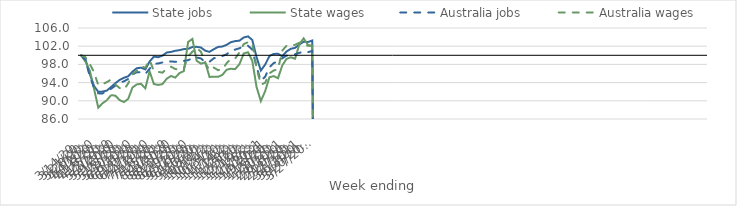
| Category | State jobs | State wages | Australia jobs | Australia wages |
|---|---|---|---|---|
| 14/03/2020 | 100 | 100 | 100 | 100 |
| 21/03/2020 | 99.174 | 98.598 | 98.97 | 99.607 |
| 28/03/2020 | 95.983 | 96.695 | 95.464 | 98.117 |
| 04/04/2020 | 93.268 | 92.691 | 92.906 | 96.324 |
| 11/04/2020 | 91.975 | 88.5 | 91.634 | 93.472 |
| 18/04/2020 | 92.022 | 89.452 | 91.618 | 93.672 |
| 25/04/2020 | 92.245 | 90.113 | 92.147 | 94.096 |
| 02/05/2020 | 93.033 | 91.255 | 92.646 | 94.684 |
| 09/05/2020 | 93.876 | 91.115 | 93.336 | 93.578 |
| 16/05/2020 | 94.582 | 90.156 | 93.928 | 92.809 |
| 23/05/2020 | 95.063 | 89.718 | 94.284 | 92.46 |
| 30/05/2020 | 95.39 | 90.434 | 94.792 | 93.812 |
| 06/06/2020 | 96.408 | 92.931 | 95.776 | 95.91 |
| 13/06/2020 | 97.159 | 93.596 | 96.277 | 96.583 |
| 20/06/2020 | 97.272 | 93.733 | 96.294 | 97.554 |
| 27/06/2020 | 96.895 | 92.734 | 95.892 | 97.289 |
| 04/07/2020 | 98.636 | 96.482 | 97.055 | 98.973 |
| 11/07/2020 | 99.711 | 93.685 | 98.106 | 96.533 |
| 18/07/2020 | 99.578 | 93.489 | 98.208 | 96.372 |
| 25/07/2020 | 99.916 | 93.666 | 98.434 | 96.181 |
| 01/08/2020 | 100.612 | 94.852 | 98.654 | 97.055 |
| 08/08/2020 | 100.748 | 95.455 | 98.656 | 97.48 |
| 15/08/2020 | 100.991 | 95.099 | 98.564 | 96.991 |
| 22/08/2020 | 101.132 | 96.105 | 98.619 | 96.84 |
| 29/08/2020 | 101.373 | 96.529 | 98.754 | 97.076 |
| 05/09/2020 | 101.418 | 102.927 | 98.928 | 99.803 |
| 12/09/2020 | 101.818 | 103.598 | 99.342 | 100.783 |
| 19/09/2020 | 101.86 | 98.79 | 99.517 | 101.637 |
| 26/09/2020 | 101.712 | 98.156 | 99.31 | 100.779 |
| 03/10/2020 | 101.012 | 98.46 | 98.488 | 98.325 |
| 10/10/2020 | 100.763 | 95.242 | 98.579 | 96.712 |
| 17/10/2020 | 101.332 | 95.288 | 99.343 | 97.299 |
| 24/10/2020 | 101.84 | 95.27 | 99.616 | 96.732 |
| 31/10/2020 | 101.923 | 95.688 | 99.832 | 96.893 |
| 07/11/2020 | 102.301 | 96.823 | 100.231 | 98.252 |
| 14/11/2020 | 102.883 | 97.049 | 100.956 | 99.261 |
| 21/11/2020 | 103.118 | 96.961 | 101.258 | 99.291 |
| 28/11/2020 | 103.218 | 98.054 | 101.546 | 100.638 |
| 05/12/2020 | 103.921 | 100.415 | 102.06 | 102.456 |
| 12/12/2020 | 104.159 | 100.675 | 102.096 | 102.885 |
| 19/12/2020 | 103.374 | 98.772 | 101.265 | 102.743 |
| 26/12/2020 | 99.592 | 93.018 | 97.433 | 97.212 |
| 02/01/2021 | 96.651 | 89.934 | 94.376 | 93.531 |
| 09/01/2021 | 97.956 | 92.105 | 95.285 | 93.978 |
| 16/01/2021 | 99.826 | 95.163 | 97.349 | 96.028 |
| 23/01/2021 | 100.306 | 95.43 | 98.277 | 96.664 |
| 30/01/2021 | 100.324 | 94.958 | 98.681 | 96.928 |
| 06/02/2021 | 99.797 | 97.769 | 99.348 | 101.023 |
| 13/02/2021 | 100.834 | 99.204 | 99.928 | 102.099 |
| 20/02/2021 | 101.428 | 99.566 | 99.969 | 102.073 |
| 27/02/2021 | 101.642 | 99.24 | 100.21 | 102.312 |
| 06/03/2021 | 102.347 | 102.442 | 100.53 | 102.759 |
| 13/03/2021 | 102.995 | 103.723 | 100.859 | 102.584 |
| 20/03/2021 | 102.909 | 102.285 | 100.674 | 102.081 |
| 27/03/2021 | 103.247 | 102.04 | 100.974 | 102.126 |